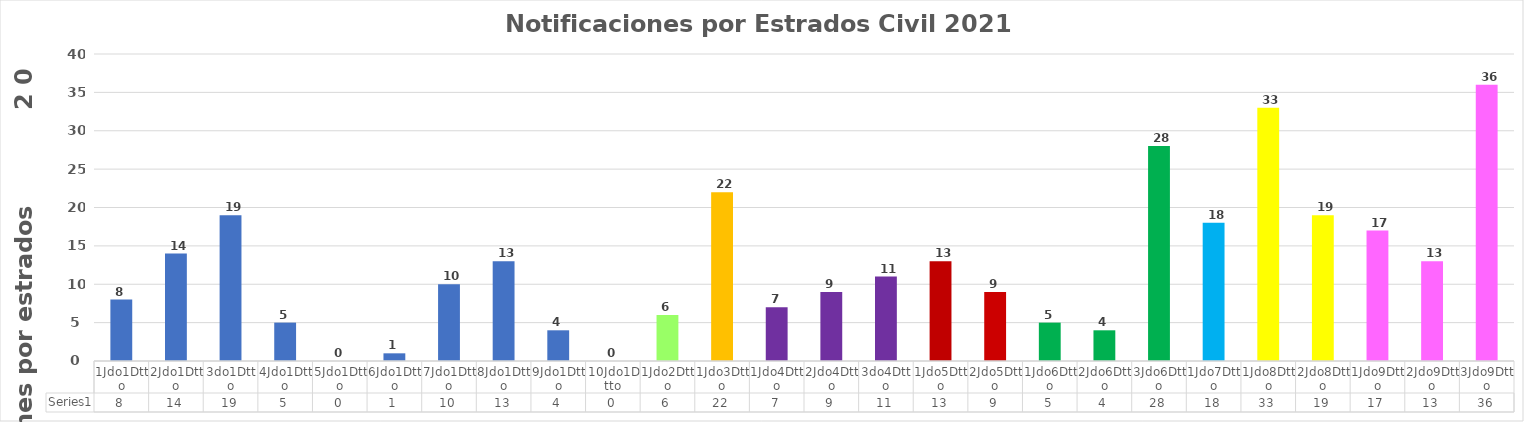
| Category | Series 0 |
|---|---|
| 1Jdo1Dtto | 8 |
| 2Jdo1Dtto | 14 |
| 3do1Dtto | 19 |
| 4Jdo1Dtto | 5 |
| 5Jdo1Dtto | 0 |
| 6Jdo1Dtto | 1 |
| 7Jdo1Dtto | 10 |
| 8Jdo1Dtto | 13 |
| 9Jdo1Dtto | 4 |
| 10Jdo1Dtto | 0 |
| 1Jdo2Dtto | 6 |
| 1Jdo3Dtto | 22 |
| 1Jdo4Dtto | 7 |
| 2Jdo4Dtto | 9 |
| 3do4Dtto | 11 |
| 1Jdo5Dtto | 13 |
| 2Jdo5Dtto | 9 |
| 1Jdo6Dtto | 5 |
| 2Jdo6Dtto | 4 |
| 3Jdo6Dtto | 28 |
| 1Jdo7Dtto | 18 |
| 1Jdo8Dtto | 33 |
| 2Jdo8Dtto | 19 |
| 1Jdo9Dtto | 17 |
| 2Jdo9Dtto | 13 |
| 3Jdo9Dtto | 36 |